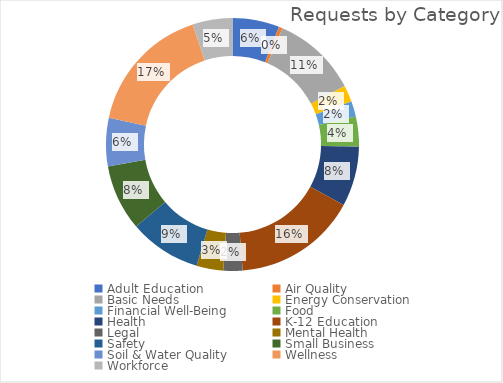
| Category | Total |
|---|---|
| Adult Education | 195000 |
| Air Quality | 15240 |
| Basic Needs | 355000 |
| Energy Conservation | 68500 |
| Financial Well-Being | 64600 |
| Food | 124300 |
| Health | 249080 |
| K-12 Education | 513906 |
| Legal | 80000 |
| Mental Health | 111000 |
| Safety | 299236 |
| Small Business | 275000 |
| Soil & Water Quality | 201156 |
| Wellness | 537349 |
| Workforce | 165545 |